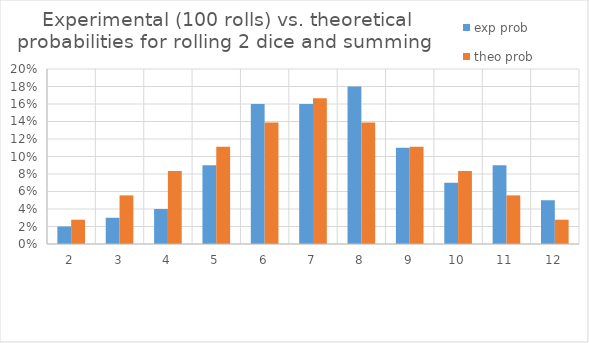
| Category | exp prob | theo prob |
|---|---|---|
| 2.0 | 0.02 | 0.028 |
| 3.0 | 0.03 | 0.056 |
| 4.0 | 0.04 | 0.083 |
| 5.0 | 0.09 | 0.111 |
| 6.0 | 0.16 | 0.139 |
| 7.0 | 0.16 | 0.167 |
| 8.0 | 0.18 | 0.139 |
| 9.0 | 0.11 | 0.111 |
| 10.0 | 0.07 | 0.083 |
| 11.0 | 0.09 | 0.056 |
| 12.0 | 0.05 | 0.028 |